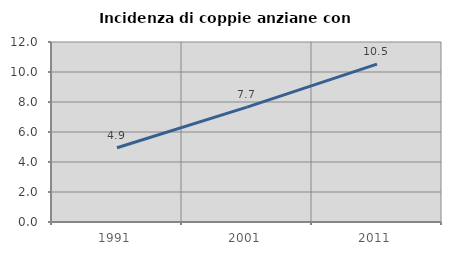
| Category | Incidenza di coppie anziane con figli |
|---|---|
| 1991.0 | 4.947 |
| 2001.0 | 7.661 |
| 2011.0 | 10.526 |